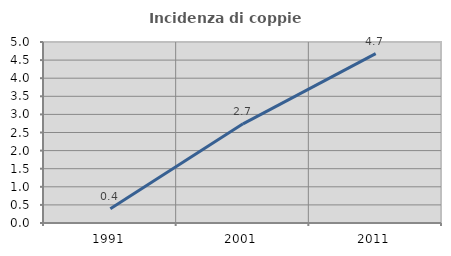
| Category | Incidenza di coppie miste |
|---|---|
| 1991.0 | 0.391 |
| 2001.0 | 2.74 |
| 2011.0 | 4.678 |